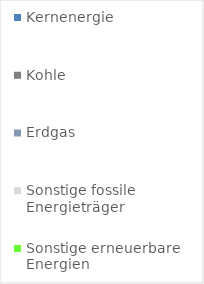
| Category | Series 0 |
|---|---|
| Kernenergie | 0 |
| Kohle | 0 |
| Erdgas | 0 |
| Sonstige fossile Energieträger | 0 |
| Sonstige erneuerbare Energien | 0.545 |
| Erneuerbare Energien, _x000d_gefördert nach dem EEG | 0.455 |